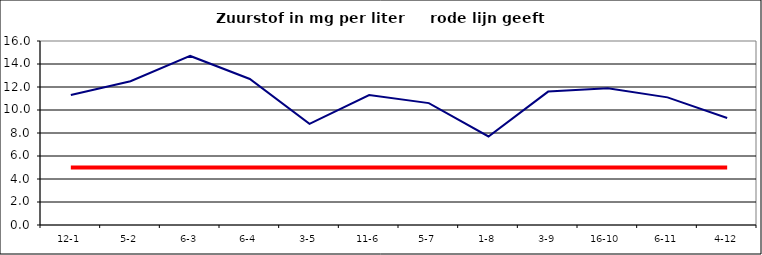
| Category | Series 0 | Series 1 |
|---|---|---|
| 12-1 | 11.3 | 5 |
| 5-2 | 12.5 | 5 |
| 6-3 | 14.7 | 5 |
| 6-4 | 12.7 | 5 |
| 3-5 | 8.8 | 5 |
| 11-6 | 11.3 | 5 |
| 5-7 | 10.6 | 5 |
| 1-8 | 7.7 | 5 |
| 3-9 | 11.6 | 5 |
| 16-10 | 11.9 | 5 |
| 6-11 | 11.1 | 5 |
| 4-12 | 9.3 | 5 |